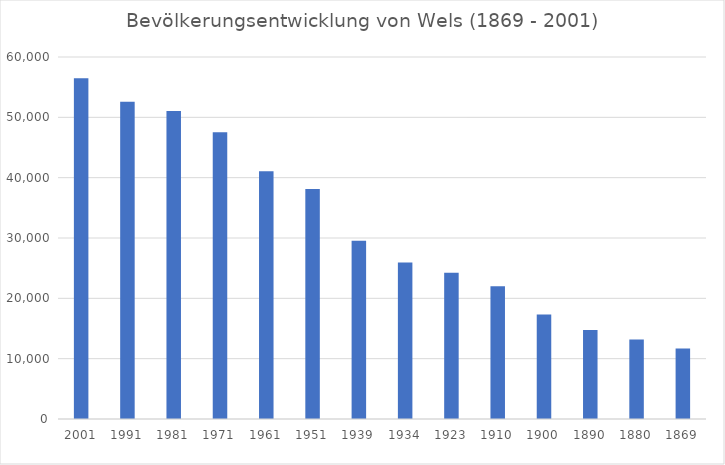
| Category | Series 0 |
|---|---|
| 2001.0 | 56478 |
| 1991.0 | 52594 |
| 1981.0 | 51060 |
| 1971.0 | 47527 |
| 1961.0 | 41060 |
| 1951.0 | 38120 |
| 1939.0 | 29533 |
| 1934.0 | 25956 |
| 1923.0 | 24248 |
| 1910.0 | 22015 |
| 1900.0 | 17308 |
| 1890.0 | 14735 |
| 1880.0 | 13175 |
| 1869.0 | 11704 |